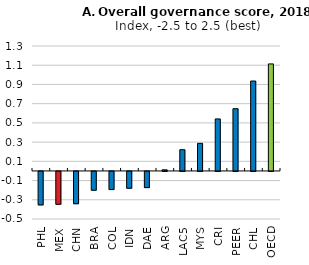
| Category | Series 0 |
|---|---|
| PHL | -0.348 |
| MEX | -0.341 |
| CHN | -0.336 |
| BRA | -0.195 |
| COL | -0.188 |
| IDN | -0.174 |
| DAE | -0.168 |
| ARG | 0.012 |
| LAC5 | 0.221 |
| MYS | 0.287 |
| CRI | 0.541 |
| PEER | 0.648 |
| CHL | 0.936 |
| OECD | 1.113 |